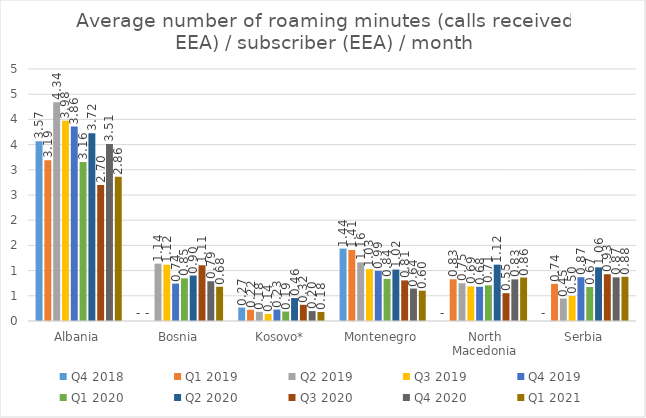
| Category | Q4 2018 | Q1 2019 | Q2 2019 | Q3 2019 | Q4 2019 | Q1 2020 | Q2 2020 | Q3 2020 | Q4 2020 | Q1 2021 |
|---|---|---|---|---|---|---|---|---|---|---|
| Albania | 3.567 | 3.19 | 4.34 | 3.975 | 3.857 | 3.157 | 3.723 | 2.697 | 3.514 | 2.862 |
| Bosnia | 0 | 0 | 1.138 | 1.116 | 0.742 | 0.846 | 0.902 | 1.106 | 0.789 | 0.68 |
| Kosovo* | 0.266 | 0.224 | 0.183 | 0.138 | 0.227 | 0.188 | 0.455 | 0.321 | 0.196 | 0.179 |
| Montenegro | 1.437 | 1.409 | 1.163 | 1.03 | 0.995 | 0.835 | 1.02 | 0.805 | 0.644 | 0.602 |
| North Macedonia | 0 | 0.828 | 0.749 | 0.686 | 0.679 | 0.708 | 1.118 | 0.552 | 0.826 | 0.861 |
| Serbia | 0 | 0.736 | 0.446 | 0.496 | 0.869 | 0.675 | 1.065 | 0.928 | 0.866 | 0.877 |